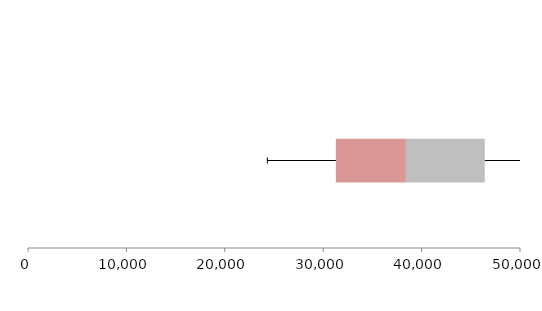
| Category | Series 1 | Series 2 | Series 3 |
|---|---|---|---|
| 0 | 31285.637 | 7118.537 | 8018.75 |